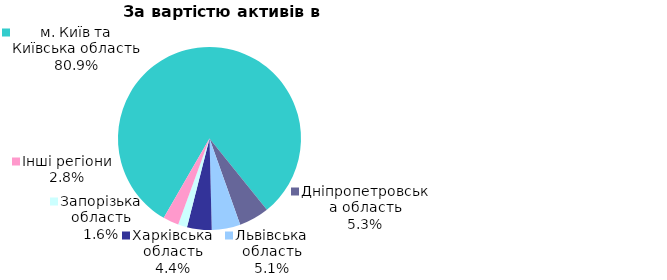
| Category | Series 0 |
|---|---|
| м. Київ та Київська область | 0.809 |
| Дніпропетровська область | 0.053 |
| Львівська область | 0.051 |
| Харківська область | 0.044 |
| Запорізька область | 0.016 |
| Інші регіони | 0.028 |